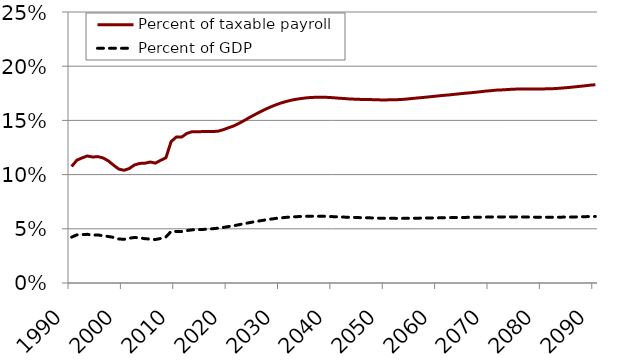
| Category | Percent of taxable payroll | Percent of GDP |
|---|---|---|
| 1990.0 | 0.108 | 0.042 |
| 1991.0 | 0.113 | 0.044 |
| 1992.0 | 0.115 | 0.045 |
| 1993.0 | 0.117 | 0.045 |
| 1994.0 | 0.116 | 0.044 |
| 1995.0 | 0.117 | 0.044 |
| 1996.0 | 0.115 | 0.044 |
| 1997.0 | 0.113 | 0.043 |
| 1998.0 | 0.109 | 0.042 |
| 1999.0 | 0.105 | 0.041 |
| 2000.0 | 0.104 | 0.04 |
| 2001.0 | 0.106 | 0.041 |
| 2002.0 | 0.109 | 0.042 |
| 2003.0 | 0.11 | 0.042 |
| 2004.0 | 0.11 | 0.041 |
| 2005.0 | 0.112 | 0.04 |
| 2006.0 | 0.111 | 0.04 |
| 2007.0 | 0.113 | 0.041 |
| 2008.0 | 0.115 | 0.042 |
| 2009.0 | 0.13 | 0.048 |
| 2010.0 | 0.135 | 0.048 |
| 2011.0 | 0.135 | 0.047 |
| 2012.0 | 0.138 | 0.048 |
| 2013.0 | 0.14 | 0.049 |
| 2014.0 | 0.14 | 0.049 |
| 2015.0 | 0.14 | 0.049 |
| 2016.0 | 0.14 | 0.05 |
| 2017.0 | 0.14 | 0.05 |
| 2018.0 | 0.14 | 0.051 |
| 2019.0 | 0.142 | 0.051 |
| 2020.0 | 0.143 | 0.052 |
| 2021.0 | 0.145 | 0.053 |
| 2022.0 | 0.147 | 0.054 |
| 2023.0 | 0.15 | 0.055 |
| 2024.0 | 0.153 | 0.056 |
| 2025.0 | 0.155 | 0.057 |
| 2026.0 | 0.158 | 0.057 |
| 2027.0 | 0.16 | 0.058 |
| 2028.0 | 0.162 | 0.059 |
| 2029.0 | 0.164 | 0.06 |
| 2030.0 | 0.166 | 0.06 |
| 2031.0 | 0.167 | 0.061 |
| 2032.0 | 0.169 | 0.061 |
| 2033.0 | 0.17 | 0.061 |
| 2034.0 | 0.17 | 0.061 |
| 2035.0 | 0.171 | 0.062 |
| 2036.0 | 0.171 | 0.062 |
| 2037.0 | 0.171 | 0.062 |
| 2038.0 | 0.171 | 0.062 |
| 2039.0 | 0.171 | 0.061 |
| 2040.0 | 0.171 | 0.061 |
| 2041.0 | 0.17 | 0.061 |
| 2042.0 | 0.17 | 0.061 |
| 2043.0 | 0.17 | 0.061 |
| 2044.0 | 0.17 | 0.06 |
| 2045.0 | 0.169 | 0.06 |
| 2046.0 | 0.169 | 0.06 |
| 2047.0 | 0.169 | 0.06 |
| 2048.0 | 0.169 | 0.06 |
| 2049.0 | 0.169 | 0.06 |
| 2050.0 | 0.169 | 0.06 |
| 2051.0 | 0.169 | 0.06 |
| 2052.0 | 0.169 | 0.06 |
| 2053.0 | 0.169 | 0.06 |
| 2054.0 | 0.17 | 0.06 |
| 2055.0 | 0.17 | 0.06 |
| 2056.0 | 0.171 | 0.06 |
| 2057.0 | 0.171 | 0.06 |
| 2058.0 | 0.172 | 0.06 |
| 2059.0 | 0.172 | 0.06 |
| 2060.0 | 0.173 | 0.06 |
| 2061.0 | 0.173 | 0.06 |
| 2062.0 | 0.174 | 0.06 |
| 2063.0 | 0.174 | 0.06 |
| 2064.0 | 0.175 | 0.06 |
| 2065.0 | 0.175 | 0.06 |
| 2066.0 | 0.175 | 0.061 |
| 2067.0 | 0.176 | 0.061 |
| 2068.0 | 0.176 | 0.061 |
| 2069.0 | 0.177 | 0.061 |
| 2070.0 | 0.177 | 0.061 |
| 2071.0 | 0.178 | 0.061 |
| 2072.0 | 0.178 | 0.061 |
| 2073.0 | 0.178 | 0.061 |
| 2074.0 | 0.179 | 0.061 |
| 2075.0 | 0.179 | 0.061 |
| 2076.0 | 0.179 | 0.061 |
| 2077.0 | 0.179 | 0.061 |
| 2078.0 | 0.179 | 0.061 |
| 2079.0 | 0.179 | 0.061 |
| 2080.0 | 0.179 | 0.061 |
| 2081.0 | 0.179 | 0.061 |
| 2082.0 | 0.179 | 0.061 |
| 2083.0 | 0.18 | 0.061 |
| 2084.0 | 0.18 | 0.061 |
| 2085.0 | 0.18 | 0.061 |
| 2086.0 | 0.181 | 0.061 |
| 2087.0 | 0.181 | 0.061 |
| 2088.0 | 0.182 | 0.061 |
| 2089.0 | 0.182 | 0.061 |
| 2090.0 | 0.183 | 0.061 |